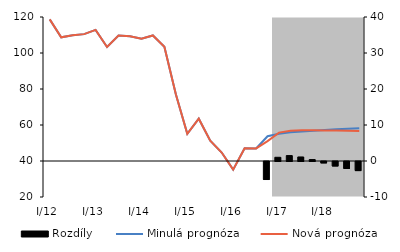
| Category | Rozdíly |
|---|---|
| 0 | 0 |
| 1 | 0 |
| 2 | 0 |
| 3 | 0 |
| 4 | 0 |
| 5 | 0 |
| 6 | 0 |
| 7 | 0 |
| 8 | 0 |
| 9 | 0 |
| 10 | 0 |
| 11 | 0 |
| 12 | 0 |
| 13 | 0 |
| 14 | 0 |
| 15 | 0 |
| 16 | 0 |
| 17 | 0 |
| 18 | 0 |
| 19 | -5.006 |
| 20 | 1.033 |
| 21 | 1.509 |
| 22 | 1.122 |
| 23 | 0.4 |
| 24 | -0.39 |
| 25 | -1.242 |
| 26 | -1.938 |
| 27 | -2.525 |